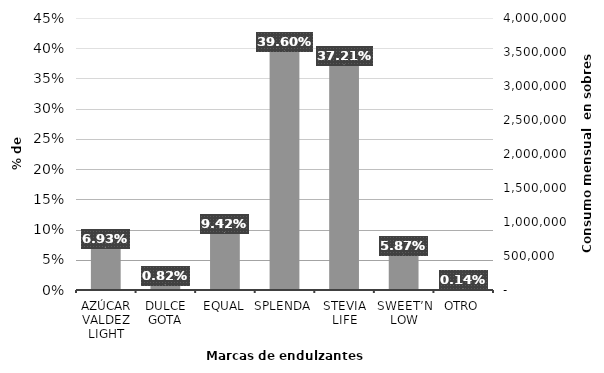
| Category | Series 0 |
|---|---|
| Azúcar Valdez Light | 0.069 |
| Dulce Gota | 0.008 |
| Equal | 0.094 |
| Splenda | 0.396 |
| Stevia Life | 0.372 |
| Sweet’N Low | 0.059 |
| Otro | 0.001 |